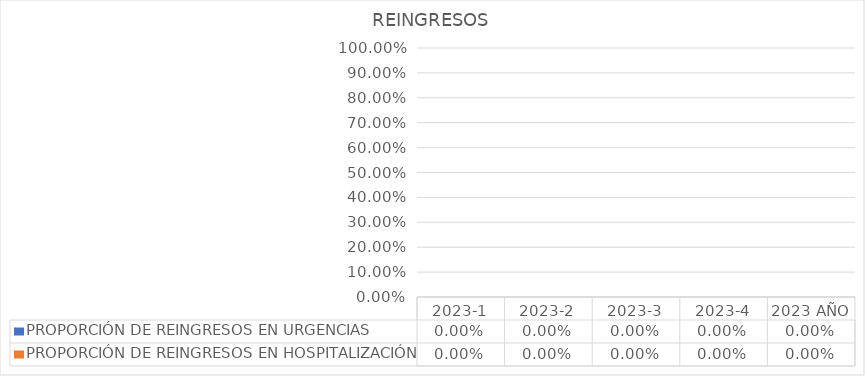
| Category | PROPORCIÓN DE REINGRESOS EN URGENCIAS  | PROPORCIÓN DE REINGRESOS EN HOSPITALIZACIÓN |
|---|---|---|
| 2023-1 | 0 | 0 |
| 2023-2 | 0 | 0 |
| 2023-3 | 0 | 0 |
| 2023-4 | 0 | 0 |
| 2023 AÑO | 0 | 0 |